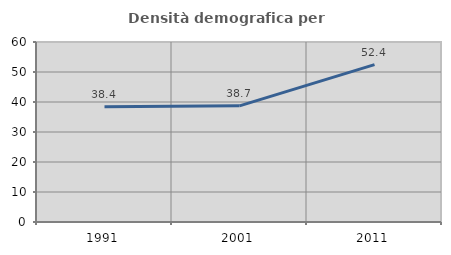
| Category | Densità demografica |
|---|---|
| 1991.0 | 38.417 |
| 2001.0 | 38.722 |
| 2011.0 | 52.442 |